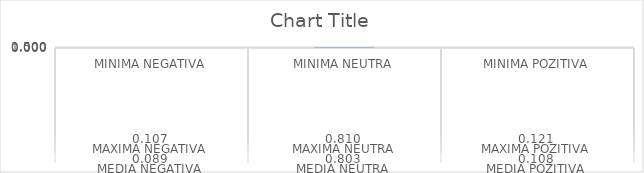
| Category | Series 0 |
|---|---|
| 0 | 0.076 |
| 1 | 0.787 |
| 2 | 0.097 |